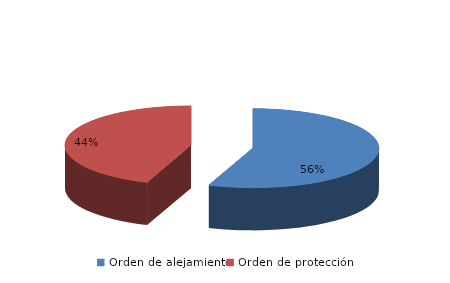
| Category | Series 0 |
|---|---|
| Orden de alejamiento | 113 |
| Orden de protección | 90 |